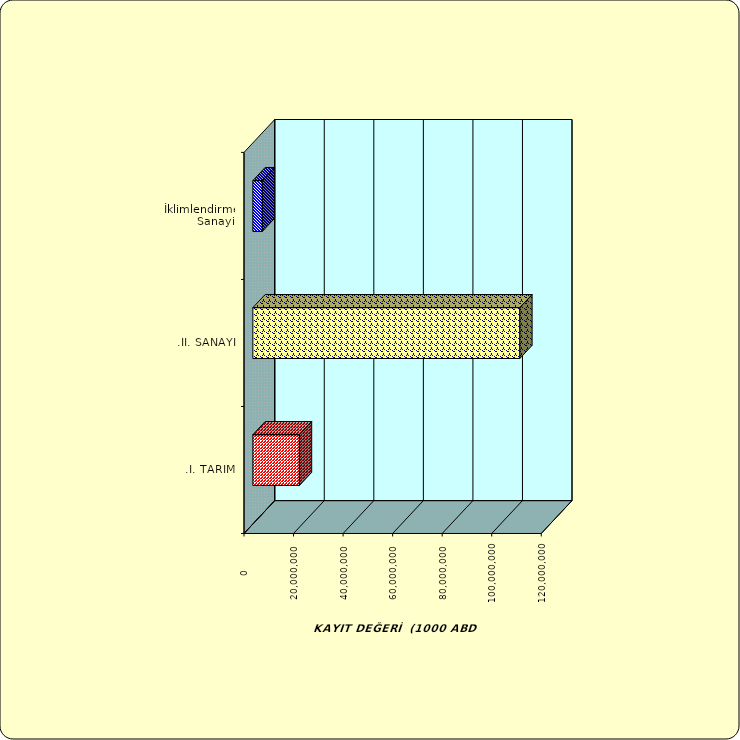
| Category | Series 0 |
|---|---|
| .I. TARIM | 18790912.945 |
| .II. SANAYİ | 107768870.248 |
|  İklimlendirme Sanayii | 3822816.282 |